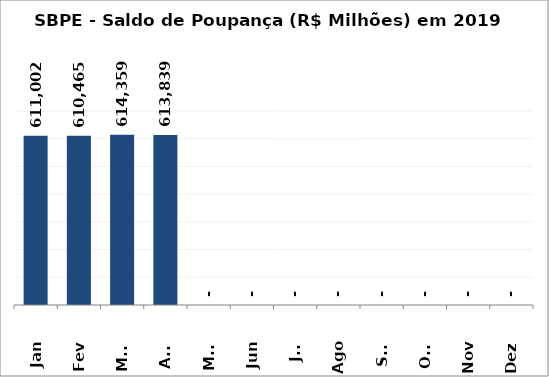
| Category | SBPE - Saldo de Poupança (R$ Milhões) em 2019 |
|---|---|
| Jan | 611001.78 |
| Fev | 610465.006 |
| Mar | 614358.561 |
| Abr | 613839.163 |
| Mai | 0 |
| Jun | 0 |
| Jul | 0 |
| Ago | 0 |
| Set | 0 |
| Out | 0 |
| Nov | 0 |
| Dez | 0 |